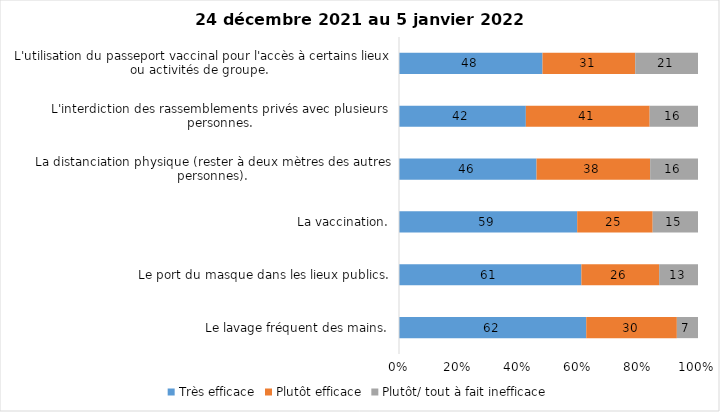
| Category | Très efficace | Plutôt efficace | Plutôt/ tout à fait inefficace |
|---|---|---|---|
| Le lavage fréquent des mains. | 62 | 30 | 7 |
| Le port du masque dans les lieux publics. | 61 | 26 | 13 |
| La vaccination. | 59 | 25 | 15 |
| La distanciation physique (rester à deux mètres des autres personnes). | 46 | 38 | 16 |
| L'interdiction des rassemblements privés avec plusieurs personnes. | 42 | 41 | 16 |
| L'utilisation du passeport vaccinal pour l'accès à certains lieux ou activités de groupe.  | 48 | 31 | 21 |